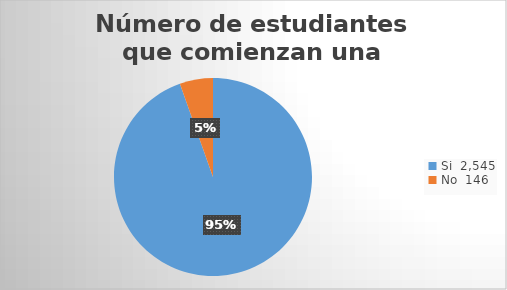
| Category | Número de estudiantes que comienzan una carrera |
|---|---|
| 0 | 2545 |
| 1 | 146 |